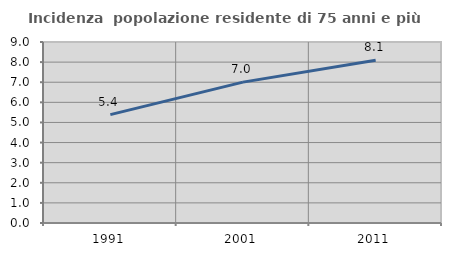
| Category | Incidenza  popolazione residente di 75 anni e più |
|---|---|
| 1991.0 | 5.389 |
| 2001.0 | 7.005 |
| 2011.0 | 8.092 |